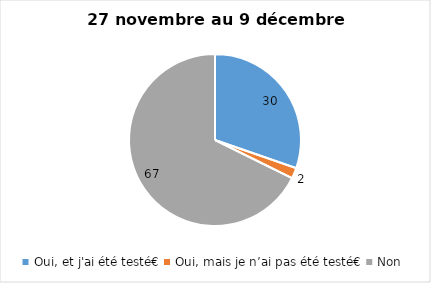
| Category | Series 0 |
|---|---|
| Oui, et j'ai été testé€ | 30 |
| Oui, mais je n’ai pas été testé€ | 2 |
| Non | 67 |